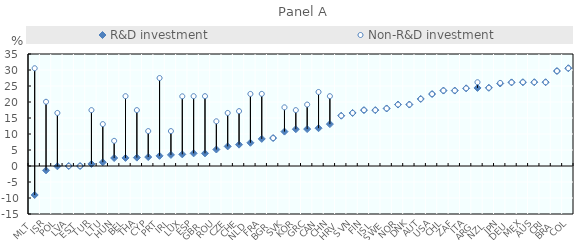
| Category | R&D investment | Non-R&D investment |
|---|---|---|
| MLT | -9.06 | 30.55 |
| ISR | -1.36 | 20.07 |
| POL | -0.09 | 16.58 |
| LVA | 0 | 0 |
| EST | 0 | 0 |
| TUR | 0.64 | 17.46 |
| LTU | 1.18 | 13.09 |
| HUN | 2.5 | 7.86 |
| BEL | 2.52 | 21.82 |
| THA | 2.62 | 17.46 |
| CYP | 2.8 | 10.91 |
| PRT | 3.17 | 27.49 |
| IRL | 3.47 | 10.91 |
| LUX | 3.64 | 21.77 |
| ESP | 3.95 | 21.82 |
| GBR | 3.95 | 21.82 |
| ROU | 5.16 | 13.97 |
| CZE | 6.13 | 16.58 |
| CHE | 6.67 | 17.15 |
| NLD | 7.26 | 22.52 |
| FRA | 8.47 | 22.54 |
| BGR | 8.73 | 8.73 |
| SVK | 10.75 | 18.33 |
| KOR | 11.5 | 17.46 |
| GRC | 11.54 | 19.2 |
| CAN | 11.81 | 23.13 |
| CHN | 13.09 | 21.82 |
| HRV | 15.71 | 15.71 |
| SVN | 16.58 | 16.58 |
| FIN | 17.46 | 17.46 |
| ISL | 17.46 | 17.46 |
| SWE | 17.98 | 17.98 |
| NOR | 19.2 | 19.2 |
| DNK | 19.2 | 19.2 |
| AUT | 20.95 | 20.95 |
| USA | 22.49 | 22.49 |
| CHL | 23.57 | 23.57 |
| ZAF | 23.57 | 23.57 |
| ITA | 24.27 | 24.27 |
| ARG | 24.39 | 26.18 |
| NZL | 24.44 | 24.44 |
| JPN | 25.78 | 25.96 |
| DEU | 26.13 | 26.13 |
| MEX | 26.18 | 26.18 |
| AUS | 26.18 | 26.18 |
| CRI | 26.18 | 26.18 |
| BRA | 29.68 | 29.68 |
| COL | 30.55 | 30.55 |